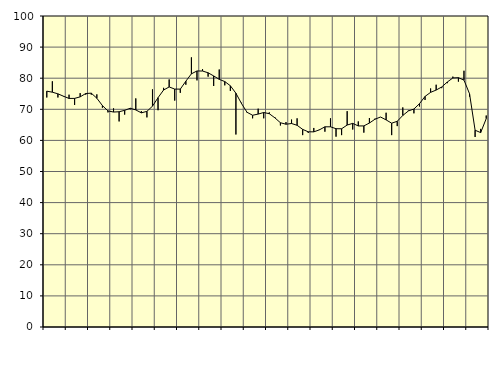
| Category | Piggar | Series 1 |
|---|---|---|
| nan | 73.8 | 75.83 |
| 1.0 | 79 | 75.5 |
| 1.0 | 73.8 | 74.97 |
| 1.0 | 74.1 | 74.21 |
| nan | 74.7 | 73.49 |
| 2.0 | 71.4 | 73.51 |
| 2.0 | 75.2 | 74 |
| 2.0 | 74.7 | 75.08 |
| nan | 74.7 | 75.19 |
| 3.0 | 74.8 | 73.56 |
| 3.0 | 70.5 | 71.2 |
| 3.0 | 69 | 69.48 |
| nan | 70.3 | 69.12 |
| 4.0 | 66.1 | 69.21 |
| 4.0 | 68.3 | 69.67 |
| 4.0 | 70 | 70.34 |
| nan | 73.5 | 69.8 |
| 5.0 | 69.4 | 68.86 |
| 5.0 | 67.4 | 69.34 |
| 5.0 | 76.4 | 71 |
| nan | 69.7 | 73.74 |
| 6.0 | 76.9 | 76.2 |
| 6.0 | 79.6 | 77.19 |
| 6.0 | 72.8 | 76.5 |
| nan | 75.3 | 76.49 |
| 7.0 | 77.9 | 79.04 |
| 7.0 | 86.7 | 81.41 |
| 7.0 | 79.3 | 82.33 |
| nan | 82.9 | 82.31 |
| 8.0 | 80.5 | 81.74 |
| 8.0 | 77.5 | 80.73 |
| 8.0 | 82.8 | 79.63 |
| nan | 77.7 | 78.92 |
| 9.0 | 75.9 | 77.57 |
| 9.0 | 61.9 | 75.17 |
| 9.0 | 72.1 | 71.87 |
| nan | 68.9 | 69.04 |
| 10.0 | 67.1 | 68.09 |
| 10.0 | 70.2 | 68.46 |
| 10.0 | 67.1 | 68.97 |
| nan | 69 | 68.58 |
| 11.0 | 67.5 | 67.26 |
| 11.0 | 64.8 | 65.68 |
| 11.0 | 65.9 | 65.2 |
| nan | 66.7 | 65.43 |
| 12.0 | 67.1 | 64.86 |
| 12.0 | 61.7 | 63.54 |
| 12.0 | 62.4 | 62.77 |
| nan | 64 | 62.75 |
| 13.0 | 63.5 | 63.38 |
| 13.0 | 62.8 | 64.37 |
| 13.0 | 67.1 | 64.37 |
| nan | 61.2 | 63.76 |
| 14.0 | 61.7 | 63.74 |
| 14.0 | 69.4 | 64.94 |
| 14.0 | 63.5 | 65.47 |
| nan | 66.1 | 64.65 |
| 15.0 | 62.5 | 64.66 |
| 15.0 | 67.2 | 65.58 |
| 15.0 | 67 | 66.81 |
| nan | 67.5 | 67.52 |
| 16.0 | 68.9 | 66.59 |
| 16.0 | 61.7 | 65.53 |
| 16.0 | 64.6 | 66.14 |
| nan | 70.6 | 68.02 |
| 17.0 | 69.6 | 69.46 |
| 17.0 | 68.7 | 70.09 |
| 17.0 | 70.9 | 71.8 |
| nan | 73 | 74.14 |
| 18.0 | 76.7 | 75.45 |
| 18.0 | 77.9 | 76.19 |
| 18.0 | 76.8 | 77.18 |
| nan | 78.4 | 78.77 |
| 19.0 | 80.5 | 80.07 |
| 19.0 | 78.9 | 80.16 |
| 19.0 | 82.4 | 79.39 |
| nan | 74.1 | 74.99 |
| 20.0 | 61.1 | 63.27 |
| 20.0 | 63.7 | 62.51 |
| 20.0 | 68 | 66.99 |